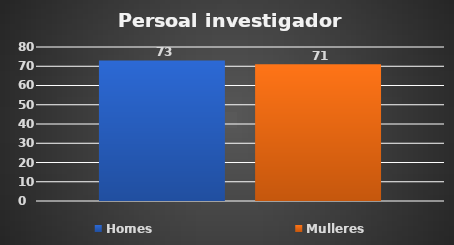
| Category | Homes | Mulleres |
|---|---|---|
| 0 | 73 | 71 |